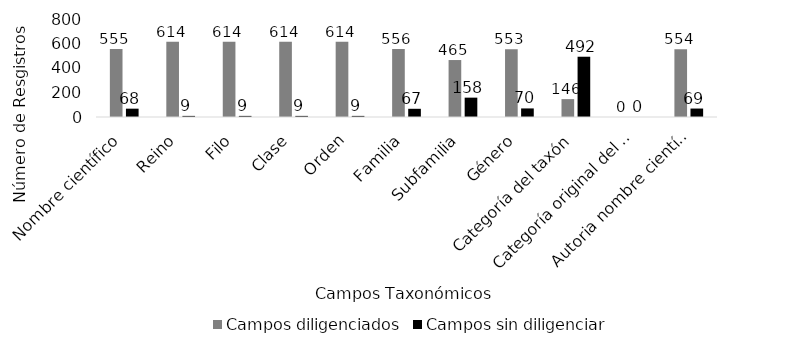
| Category | Campos diligenciados | Campos sin diligenciar |
|---|---|---|
| Nombre científico | 555 | 68 |
| Reino | 614 | 9 |
| Filo | 614 | 9 |
| Clase | 614 | 9 |
| Orden | 614 | 9 |
| Familia | 556 | 67 |
| Subfamilia | 465 | 158 |
| Género | 553 | 70 |
| Categoría del taxón | 146 | 492 |
| Categoría original del taxón | 0 | 0 |
| Autoria nombre científico | 554 | 69 |